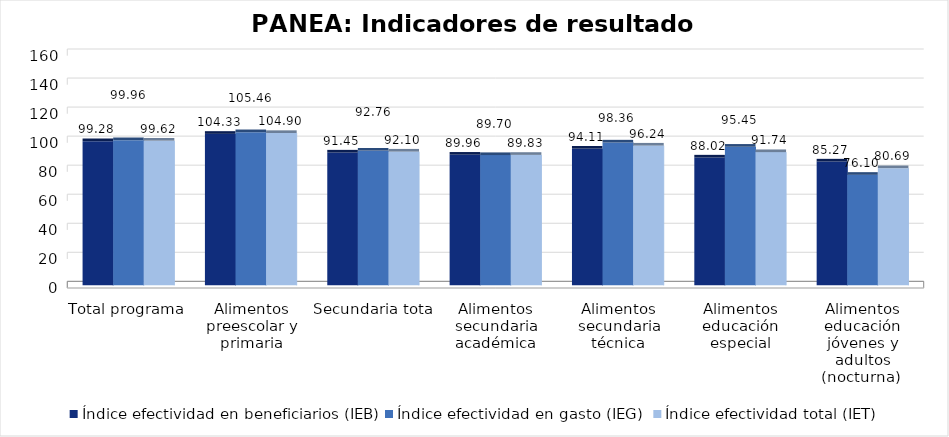
| Category | Índice efectividad en beneficiarios (IEB) | Índice efectividad en gasto (IEG)  | Índice efectividad total (IET) |
|---|---|---|---|
| Total programa | 99.279 | 99.959 | 99.619 |
| Alimentos preescolar y primaria | 104.329 | 105.464 | 104.896 |
| Secundaria total | 91.453 | 92.755 | 92.104 |
| Alimentos secundaria académica | 89.958 | 89.704 | 89.831 |
| Alimentos secundaria técnica | 94.113 | 98.363 | 96.238 |
| Alimentos educación especial | 88.022 | 95.452 | 91.737 |
| Alimentos educación jóvenes y adultos (nocturna)  | 85.274 | 76.104 | 80.689 |